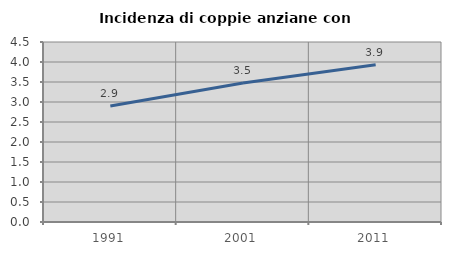
| Category | Incidenza di coppie anziane con figli |
|---|---|
| 1991.0 | 2.899 |
| 2001.0 | 3.476 |
| 2011.0 | 3.933 |